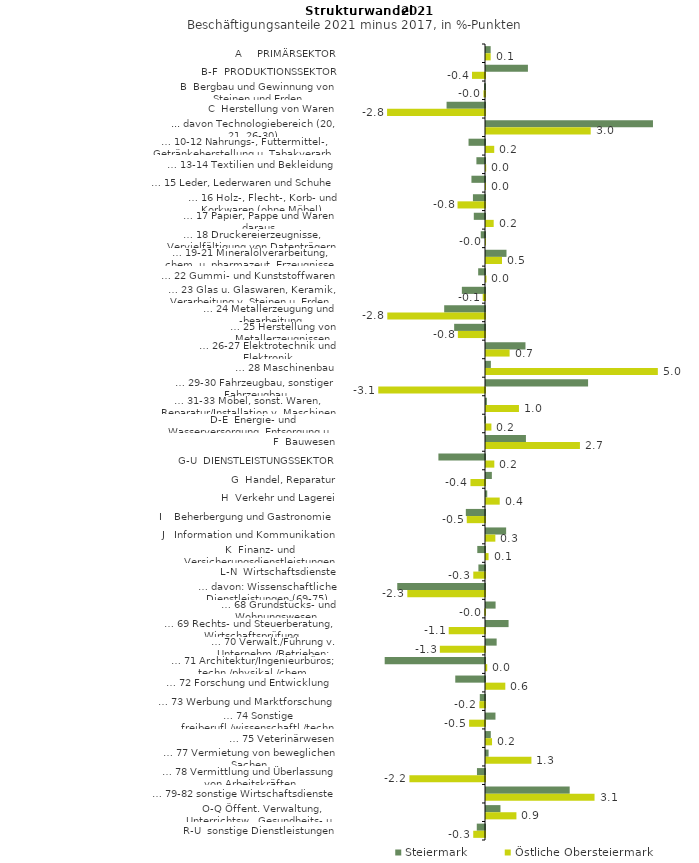
| Category | Steiermark | Östliche Obersteiermark |
|---|---|---|
| A     PRIMÄRSEKTOR | 0.135 | 0.136 |
| B-F  PRODUKTIONSSEKTOR | 1.215 | -0.377 |
| B  Bergbau und Gewinnung von Steinen und Erden | -0.029 | -0.045 |
| C  Herstellung von Waren | -1.114 | -2.838 |
| ... davon Technologiebereich (20, 21, 26-30) | 4.84 | 3.035 |
| … 10-12 Nahrungs-, Futtermittel-, Getränkeherstellung u. Tabakverarb. | -0.477 | 0.238 |
| … 13-14 Textilien und Bekleidung | -0.249 | 0.006 |
| … 15 Leder, Lederwaren und Schuhe | -0.393 | 0 |
| … 16 Holz-, Flecht-, Korb- und Korkwaren (ohne Möbel)  | -0.35 | -0.796 |
| … 17 Papier, Pappe und Waren daraus  | -0.325 | 0.223 |
| … 18 Druckereierzeugnisse, Vervielfältigung von Datenträgern | -0.124 | -0.001 |
| … 19-21 Mineralölverarbeitung, chem. u. pharmazeut. Erzeugnisse | 0.594 | 0.463 |
| … 22 Gummi- und Kunststoffwaren | -0.198 | 0.014 |
| … 23 Glas u. Glaswaren, Keramik, Verarbeitung v. Steinen u. Erden  | -0.671 | -0.066 |
| … 24 Metallerzeugung und -bearbeitung | -1.183 | -2.832 |
| … 25 Herstellung von Metallerzeugnissen  | -0.894 | -0.787 |
| … 26-27 Elektrotechnik und Elektronik | 1.144 | 0.684 |
| … 28 Maschinenbau | 0.141 | 4.981 |
| … 29-30 Fahrzeugbau, sonstiger Fahrzeugbau | 2.959 | -3.094 |
| … 31-33 Möbel, sonst. Waren, Reparatur/Installation v. Maschinen | 0.026 | 0.955 |
| D-E  Energie- und Wasserversorgung, Entsorgung u. Rückgewinnung | -0.016 | 0.156 |
| F  Bauwesen | 1.158 | 2.723 |
| G-U  DIENSTLEISTUNGSSEKTOR | -1.351 | 0.241 |
| G  Handel, Reparatur | 0.17 | -0.422 |
| H  Verkehr und Lagerei | 0.036 | 0.398 |
| I    Beherbergung und Gastronomie | -0.556 | -0.528 |
| J   Information und Kommunikation | 0.584 | 0.271 |
| K  Finanz- und Versicherungsdienstleistungen | -0.224 | 0.074 |
| L-N  Wirtschaftsdienste | -0.191 | -0.339 |
| … davon: Wissenschaftliche Dienstleistungen (69-75) | -2.544 | -2.251 |
| … 68 Grundstücks- und Wohnungswesen  | 0.278 | -0.021 |
| … 69 Rechts- und Steuerberatung, Wirtschaftsprüfung | 0.654 | -1.051 |
| … 70 Verwalt./Führung v. Unternehm./Betrieben; Unternehmensberat. | 0.309 | -1.309 |
| … 71 Architektur/Ingenieurbüros; techn./physikal./chem. Untersuchung | -2.908 | 0.035 |
| … 72 Forschung und Entwicklung  | -0.862 | 0.56 |
| … 73 Werbung und Marktforschung | -0.151 | -0.163 |
| … 74 Sonstige freiberufl./wissenschaftl./techn. Tätigkeiten | 0.275 | -0.46 |
| … 75 Veterinärwesen | 0.139 | 0.175 |
| … 77 Vermietung von beweglichen Sachen  | 0.075 | 1.317 |
| … 78 Vermittlung und Überlassung von Arbeitskräften | -0.233 | -2.191 |
| … 79-82 sonstige Wirtschaftsdienste | 2.426 | 3.146 |
| O-Q Öffent. Verwaltung, Unterrichtsw., Gesundheits- u. Sozialwesen | 0.419 | 0.882 |
| R-U  sonstige Dienstleistungen | -0.238 | -0.341 |